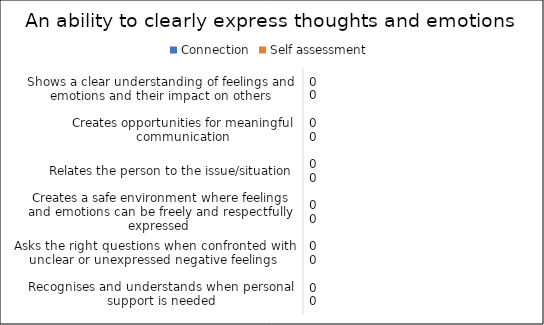
| Category | Connection | Self assessment |
|---|---|---|
| Shows a clear understanding of feelings and emotions and their impact on others | 0 | 0 |
| Creates opportunities for meaningful communication | 0 | 0 |
| Relates the person to the issue/situation | 0 | 0 |
| Creates a safe environment where feelings and emotions can be freely and respectfully expressed  | 0 | 0 |
| Asks the right questions when confronted with unclear or unexpressed negative feelings | 0 | 0 |
| Recognises and understands when personal support is needed | 0 | 0 |